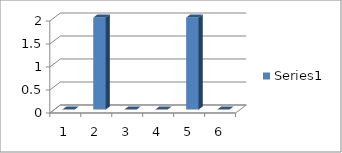
| Category | Series 0 |
|---|---|
| 0 | 0 |
| 1 | 2 |
| 2 | 0 |
| 3 | 0 |
| 4 | 2 |
| 5 | 0 |